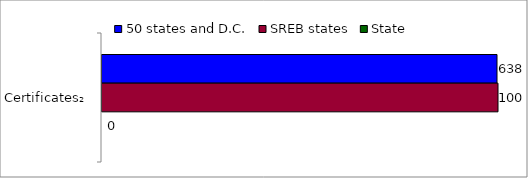
| Category | 50 states and D.C. | SREB states | State |
|---|---|---|---|
| Certificates₂ | 638 | 100 | 0 |